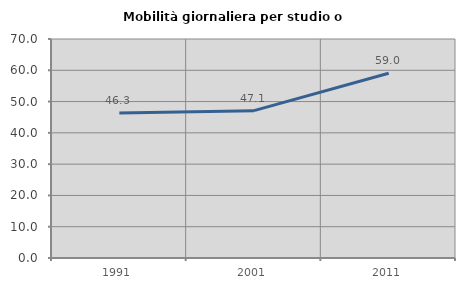
| Category | Mobilità giornaliera per studio o lavoro |
|---|---|
| 1991.0 | 46.318 |
| 2001.0 | 47.092 |
| 2011.0 | 59.03 |